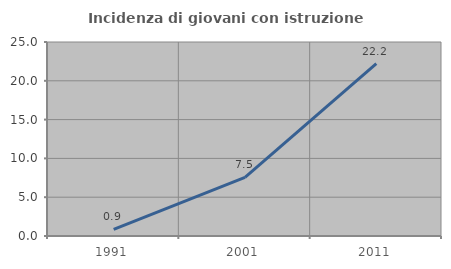
| Category | Incidenza di giovani con istruzione universitaria |
|---|---|
| 1991.0 | 0.862 |
| 2001.0 | 7.547 |
| 2011.0 | 22.222 |